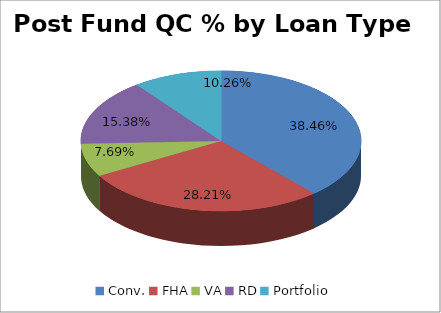
| Category | Post-Closing QC % (Current Month) |
|---|---|
| Conv. | 0.385 |
| FHA | 0.282 |
| VA | 0.077 |
| RD | 0.154 |
| Portfolio | 0.103 |